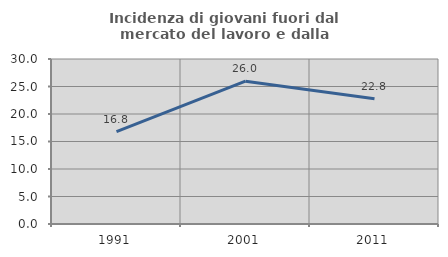
| Category | Incidenza di giovani fuori dal mercato del lavoro e dalla formazione  |
|---|---|
| 1991.0 | 16.794 |
| 2001.0 | 25.967 |
| 2011.0 | 22.772 |